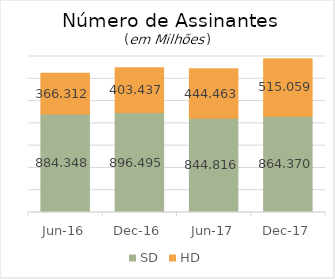
| Category | SD | HD |
|---|---|---|
| 2016-06-01 | 884347533.086 | 366311773.779 |
| 2016-12-01 | 896494906.09 | 403436802.518 |
| 2017-06-01 | 844816064.781 | 444463308.672 |
| 2017-12-01 | 864370422.434 | 515059261.677 |